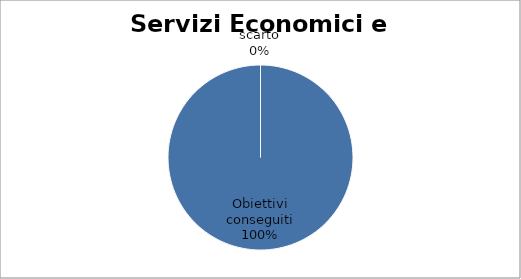
| Category | Series 0 |
|---|---|
| Obiettivi conseguiti | 100 |
| scarto | 0 |